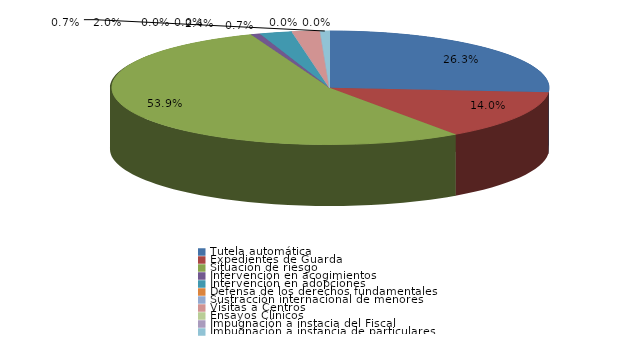
| Category | Series 0 |
|---|---|
| Tutela automática | 77 |
| Expedientes de Guarda | 41 |
| Situación de riesgo | 158 |
| Intervención en acogimientos | 2 |
| Intervención en adopciones | 7 |
| Defensa de los derechos fundamentales | 0 |
| Sustracción internacional de menores | 0 |
| Visitas a Centros | 6 |
| Ensayos Clínicos | 0 |
| Impugnación a instacia del Fiscal | 0 |
| Impugnación a instancia de particulares | 2 |